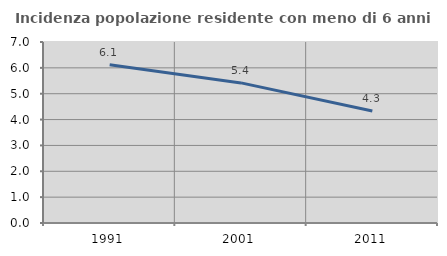
| Category | Incidenza popolazione residente con meno di 6 anni |
|---|---|
| 1991.0 | 6.118 |
| 2001.0 | 5.419 |
| 2011.0 | 4.334 |